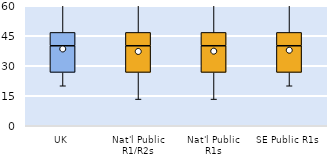
| Category | 25th | 50th | 75th |
|---|---|---|---|
| UK | 26.667 | 13.333 | 6.667 |
| Nat'l Public R1/R2s | 26.667 | 13.333 | 6.667 |
| Nat'l Public R1s | 26.667 | 13.333 | 6.667 |
| SE Public R1s | 26.667 | 13.333 | 6.667 |